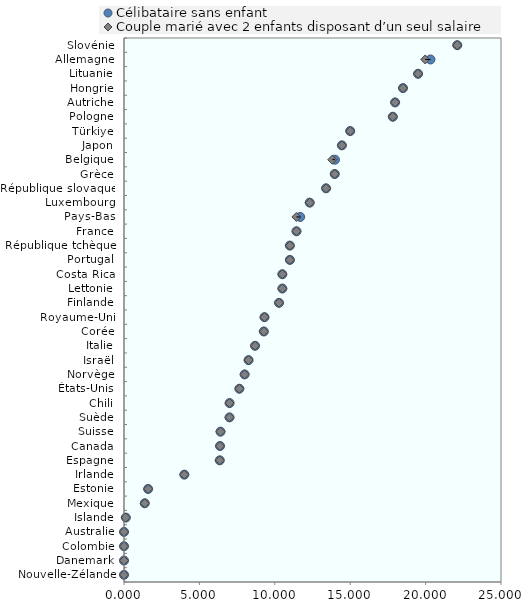
| Category | blankName |
|---|---|
| Nouvelle-Zélande | 0 |
| Danemark | 0 |
| Colombie | 0 |
| Australie | 0 |
| Islande | 0.121 |
| Mexique | 1.378 |
| Estonie | 1.6 |
| Irlande | 4 |
| Espagne | 6.35 |
| Canada | 6.368 |
| Suisse | 6.4 |
| Suède | 6.997 |
| Chili | 7 |
| États-Unis | 7.65 |
| Norvège | 8 |
| Israël | 8.259 |
| Italie | 8.69 |
| Corée | 9.274 |
| Royaume-Uni | 9.315 |
| Finlande | 10.28 |
| Lettonie | 10.5 |
| Costa Rica | 10.5 |
| Portugal | 11 |
| République tchèque | 11 |
| France | 11.438 |
| Pays-Bas | 11.432 |
| Luxembourg | 12.315 |
| République slovaque | 13.4 |
| Grèce | 13.974 |
| Belgique | 13.811 |
| Japon | 14.45 |
| Türkiye | 15 |
| Pologne | 17.826 |
| Autriche | 17.977 |
| Hongrie | 18.5 |
| Lituanie | 19.5 |
| Allemagne | 19.975 |
| Slovénie | 22.1 |